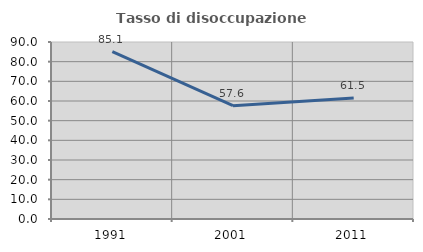
| Category | Tasso di disoccupazione giovanile  |
|---|---|
| 1991.0 | 85.075 |
| 2001.0 | 57.627 |
| 2011.0 | 61.538 |